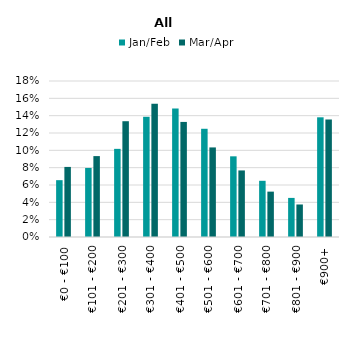
| Category | Jan/Feb | Mar/Apr |
|---|---|---|
| €0 - €100 | 0.066 | 0.081 |
| €101 - €200 | 0.08 | 0.093 |
| €201 - €300 | 0.102 | 0.134 |
| €301 - €400 | 0.139 | 0.154 |
| €401 - €500 | 0.148 | 0.133 |
| €501 - €600 | 0.125 | 0.103 |
| €601 - €700 | 0.093 | 0.077 |
| €701 - €800 | 0.065 | 0.052 |
| €801 - €900 | 0.045 | 0.038 |
| €900+ | 0.138 | 0.136 |